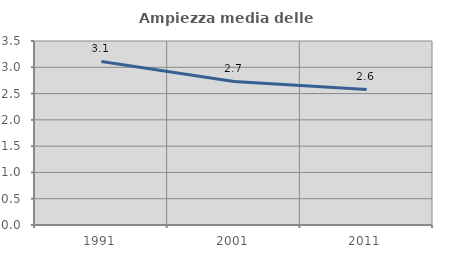
| Category | Ampiezza media delle famiglie |
|---|---|
| 1991.0 | 3.111 |
| 2001.0 | 2.73 |
| 2011.0 | 2.577 |